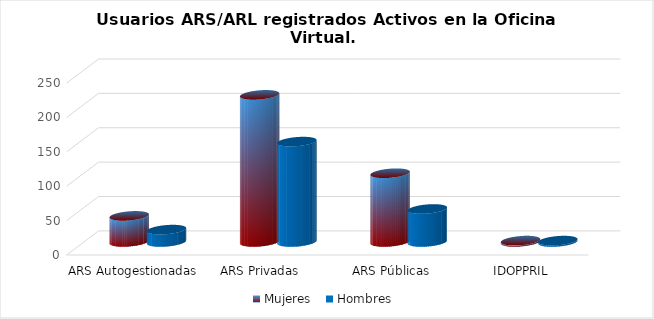
| Category | Mujeres | Hombres |
|---|---|---|
| ARS Autogestionadas | 38 | 18 |
| ARS Privadas | 214 | 146 |
| ARS Públicas | 100 | 48 |
| IDOPPRIL | 2 | 2 |